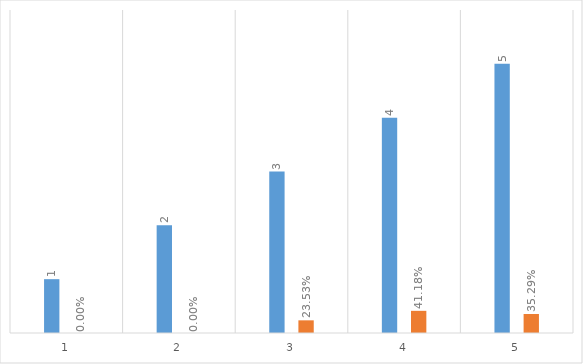
| Category | Series 0 | Series 1 |
|---|---|---|
| 0 | 1 | 0 |
| 1 | 2 | 0 |
| 2 | 3 | 0.235 |
| 3 | 4 | 0.412 |
| 4 | 5 | 0.353 |